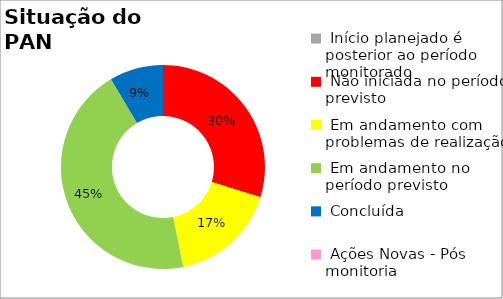
| Category | Series 0 |
|---|---|
|  Início planejado é posterior ao período monitorado | 0 |
|  Não iniciada no período previsto | 0.298 |
|  Em andamento com problemas de realização | 0.17 |
|  Em andamento no período previsto  | 0.447 |
|  Concluída | 0.085 |
|  Ações Novas - Pós monitoria | 0 |